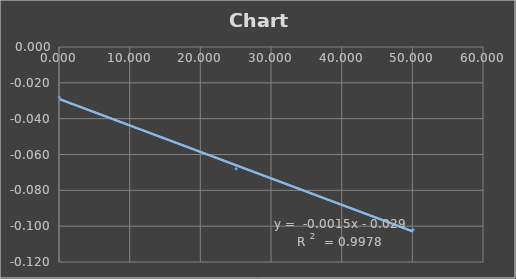
| Category | Series 0 |
|---|---|
| 0.028 | -0.028 |
| 25.062 | -0.068 |
| 50.092 | -0.102 |